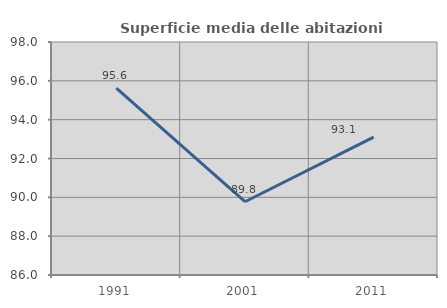
| Category | Superficie media delle abitazioni occupate |
|---|---|
| 1991.0 | 95.618 |
| 2001.0 | 89.774 |
| 2011.0 | 93.103 |